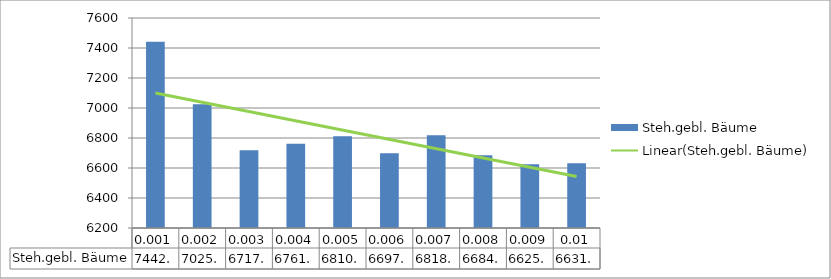
| Category | Steh.gebl. Bäume |
|---|---|
| 0.001 | 7442.37 |
| 0.002 | 7025.8 |
| 0.003 | 6717.93 |
| 0.004 | 6761.06 |
| 0.005 | 6810.88 |
| 0.006 | 6697.66 |
| 0.007 | 6818.7 |
| 0.008 | 6684.98 |
| 0.009 | 6625.52 |
| 0.01 | 6631.85 |